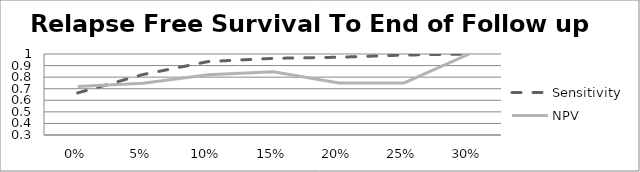
| Category | Sensitivity | NPV |
|---|---|---|
| 0.0 | 0.664 | 0.719 |
| 0.05 | 0.822 | 0.747 |
| 0.1 | 0.935 | 0.821 |
| 0.15 | 0.963 | 0.846 |
| 0.2 | 0.972 | 0.75 |
| 0.25 | 0.991 | 0.75 |
| 0.3 | 1 | 1 |